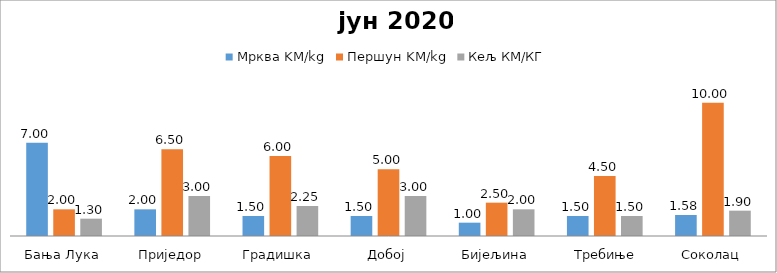
| Category | Мрква KM/kg | Першун KM/kg | Кељ КМ/КГ |
|---|---|---|---|
| Бања Лука | 7 | 2 | 1.3 |
| Приједор | 2 | 6.5 | 3 |
| Градишка | 1.5 | 6 | 2.25 |
| Добој | 1.5 | 5 | 3 |
| Бијељина | 1 | 2.5 | 2 |
|  Требиње | 1.5 | 4.5 | 1.5 |
| Соколац | 1.575 | 10 | 1.9 |